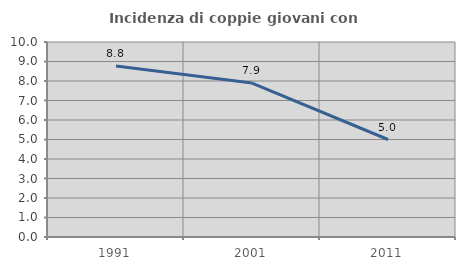
| Category | Incidenza di coppie giovani con figli |
|---|---|
| 1991.0 | 8.772 |
| 2001.0 | 7.895 |
| 2011.0 | 5 |